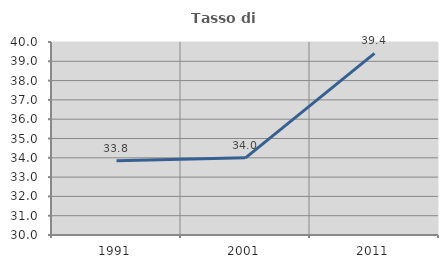
| Category | Tasso di occupazione   |
|---|---|
| 1991.0 | 33.843 |
| 2001.0 | 33.998 |
| 2011.0 | 39.415 |